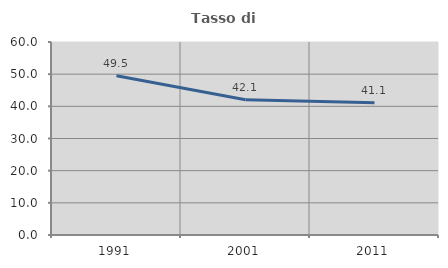
| Category | Tasso di occupazione   |
|---|---|
| 1991.0 | 49.516 |
| 2001.0 | 42.063 |
| 2011.0 | 41.116 |